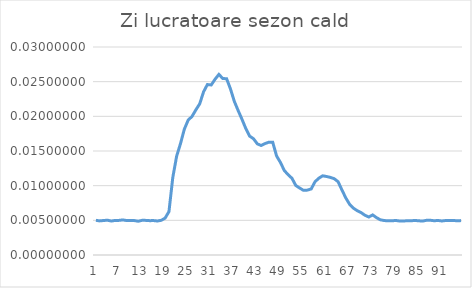
| Category | Series 0 |
|---|---|
| 0 | 0.005 |
| 1 | 0.005 |
| 2 | 0.005 |
| 3 | 0.005 |
| 4 | 0.005 |
| 5 | 0.005 |
| 6 | 0.005 |
| 7 | 0.005 |
| 8 | 0.005 |
| 9 | 0.005 |
| 10 | 0.005 |
| 11 | 0.005 |
| 12 | 0.005 |
| 13 | 0.005 |
| 14 | 0.005 |
| 15 | 0.005 |
| 16 | 0.005 |
| 17 | 0.005 |
| 18 | 0.005 |
| 19 | 0.006 |
| 20 | 0.011 |
| 21 | 0.014 |
| 22 | 0.016 |
| 23 | 0.018 |
| 24 | 0.019 |
| 25 | 0.02 |
| 26 | 0.021 |
| 27 | 0.022 |
| 28 | 0.024 |
| 29 | 0.025 |
| 30 | 0.025 |
| 31 | 0.025 |
| 32 | 0.026 |
| 33 | 0.025 |
| 34 | 0.025 |
| 35 | 0.024 |
| 36 | 0.022 |
| 37 | 0.021 |
| 38 | 0.02 |
| 39 | 0.018 |
| 40 | 0.017 |
| 41 | 0.017 |
| 42 | 0.016 |
| 43 | 0.016 |
| 44 | 0.016 |
| 45 | 0.016 |
| 46 | 0.016 |
| 47 | 0.014 |
| 48 | 0.013 |
| 49 | 0.012 |
| 50 | 0.012 |
| 51 | 0.011 |
| 52 | 0.01 |
| 53 | 0.01 |
| 54 | 0.009 |
| 55 | 0.009 |
| 56 | 0.01 |
| 57 | 0.011 |
| 58 | 0.011 |
| 59 | 0.011 |
| 60 | 0.011 |
| 61 | 0.011 |
| 62 | 0.011 |
| 63 | 0.011 |
| 64 | 0.009 |
| 65 | 0.008 |
| 66 | 0.007 |
| 67 | 0.007 |
| 68 | 0.006 |
| 69 | 0.006 |
| 70 | 0.006 |
| 71 | 0.005 |
| 72 | 0.006 |
| 73 | 0.005 |
| 74 | 0.005 |
| 75 | 0.005 |
| 76 | 0.005 |
| 77 | 0.005 |
| 78 | 0.005 |
| 79 | 0.005 |
| 80 | 0.005 |
| 81 | 0.005 |
| 82 | 0.005 |
| 83 | 0.005 |
| 84 | 0.005 |
| 85 | 0.005 |
| 86 | 0.005 |
| 87 | 0.005 |
| 88 | 0.005 |
| 89 | 0.005 |
| 90 | 0.005 |
| 91 | 0.005 |
| 92 | 0.005 |
| 93 | 0.005 |
| 94 | 0.005 |
| 95 | 0.005 |